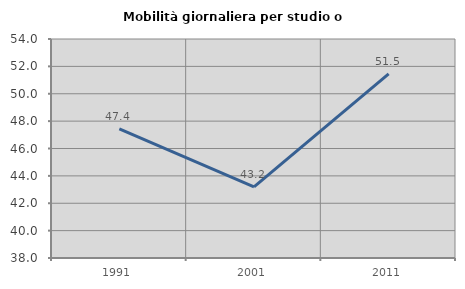
| Category | Mobilità giornaliera per studio o lavoro |
|---|---|
| 1991.0 | 47.439 |
| 2001.0 | 43.199 |
| 2011.0 | 51.452 |